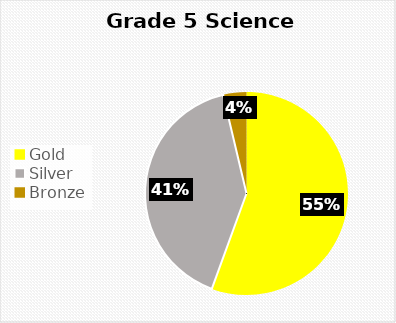
| Category | Series 0 |
|---|---|
| Gold | 15 |
| Silver | 11 |
| Bronze  | 1 |